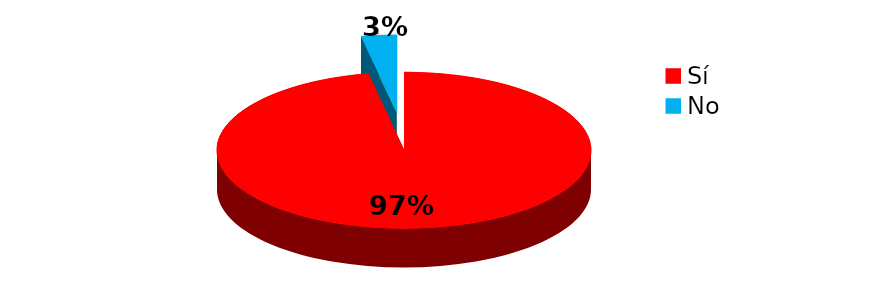
| Category | Series 0 |
|---|---|
| Sí | 316 |
| No | 10 |